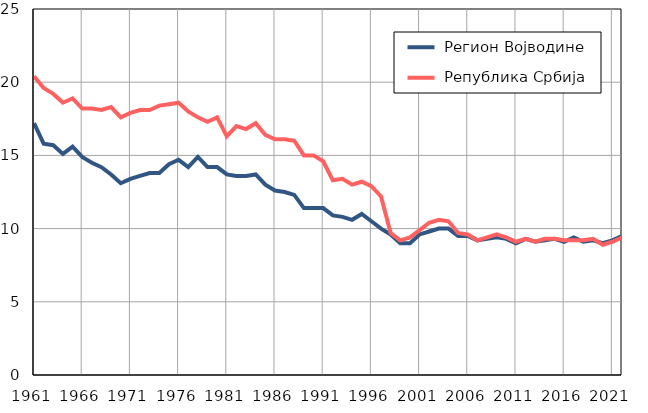
| Category |  Регион Војводине |  Република Србија |
|---|---|---|
| 1961.0 | 17.2 | 20.4 |
| 1962.0 | 15.8 | 19.6 |
| 1963.0 | 15.7 | 19.2 |
| 1964.0 | 15.1 | 18.6 |
| 1965.0 | 15.6 | 18.9 |
| 1966.0 | 14.9 | 18.2 |
| 1967.0 | 14.5 | 18.2 |
| 1968.0 | 14.2 | 18.1 |
| 1969.0 | 13.7 | 18.3 |
| 1970.0 | 13.1 | 17.6 |
| 1971.0 | 13.4 | 17.9 |
| 1972.0 | 13.6 | 18.1 |
| 1973.0 | 13.8 | 18.1 |
| 1974.0 | 13.8 | 18.4 |
| 1975.0 | 14.4 | 18.5 |
| 1976.0 | 14.7 | 18.6 |
| 1977.0 | 14.2 | 18 |
| 1978.0 | 14.9 | 17.6 |
| 1979.0 | 14.2 | 17.3 |
| 1980.0 | 14.2 | 17.6 |
| 1981.0 | 13.7 | 16.3 |
| 1982.0 | 13.6 | 17 |
| 1983.0 | 13.6 | 16.8 |
| 1984.0 | 13.7 | 17.2 |
| 1985.0 | 13 | 16.4 |
| 1986.0 | 12.6 | 16.1 |
| 1987.0 | 12.5 | 16.1 |
| 1988.0 | 12.3 | 16 |
| 1989.0 | 11.4 | 15 |
| 1990.0 | 11.4 | 15 |
| 1991.0 | 11.4 | 14.6 |
| 1992.0 | 10.9 | 13.3 |
| 1993.0 | 10.8 | 13.4 |
| 1994.0 | 10.6 | 13 |
| 1995.0 | 11 | 13.2 |
| 1996.0 | 10.5 | 12.9 |
| 1997.0 | 10 | 12.2 |
| 1998.0 | 9.6 | 9.7 |
| 1999.0 | 9 | 9.2 |
| 2000.0 | 9 | 9.4 |
| 2001.0 | 9.6 | 9.9 |
| 2002.0 | 9.8 | 10.4 |
| 2003.0 | 10 | 10.6 |
| 2004.0 | 10 | 10.5 |
| 2005.0 | 9.5 | 9.7 |
| 2006.0 | 9.5 | 9.6 |
| 2007.0 | 9.2 | 9.2 |
| 2008.0 | 9.3 | 9.4 |
| 2009.0 | 9.4 | 9.6 |
| 2010.0 | 9.3 | 9.4 |
| 2011.0 | 9 | 9.1 |
| 2012.0 | 9.3 | 9.3 |
| 2013.0 | 9.1 | 9.1 |
| 2014.0 | 9.2 | 9.3 |
| 2015.0 | 9.3 | 9.3 |
| 2016.0 | 9.1 | 9.2 |
| 2017.0 | 9.4 | 9.2 |
| 2018.0 | 9.1 | 9.2 |
| 2019.0 | 9.2 | 9.3 |
| 2020.0 | 9 | 8.9 |
| 2021.0 | 9.2 | 9.1 |
| 2022.0 | 9.5 | 9.4 |